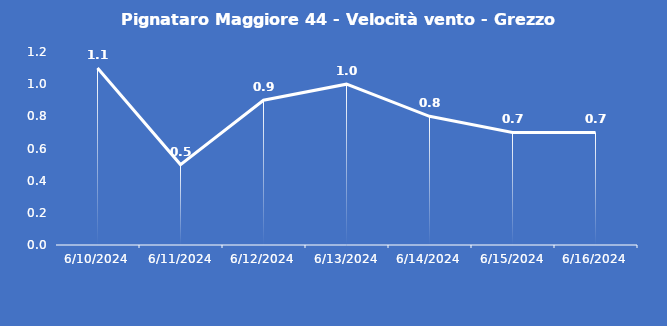
| Category | Pignataro Maggiore 44 - Velocità vento - Grezzo (m/s) |
|---|---|
| 6/10/24 | 1.1 |
| 6/11/24 | 0.5 |
| 6/12/24 | 0.9 |
| 6/13/24 | 1 |
| 6/14/24 | 0.8 |
| 6/15/24 | 0.7 |
| 6/16/24 | 0.7 |